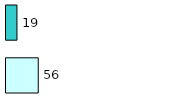
| Category | Series 0 | Series 1 |
|---|---|---|
| 0 | 56 | 19 |